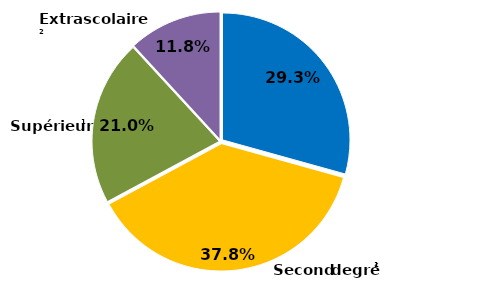
| Category | Series 0 |
|---|---|
| Premier degré | 0.293 |
| Second degré | 0.378 |
| Supérieur | 0.21 |
| Extrascolaire | 0.118 |